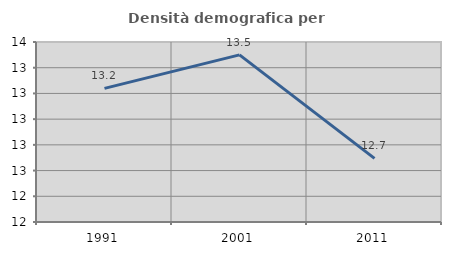
| Category | Densità demografica |
|---|---|
| 1991.0 | 13.24 |
| 2001.0 | 13.5 |
| 2011.0 | 12.695 |